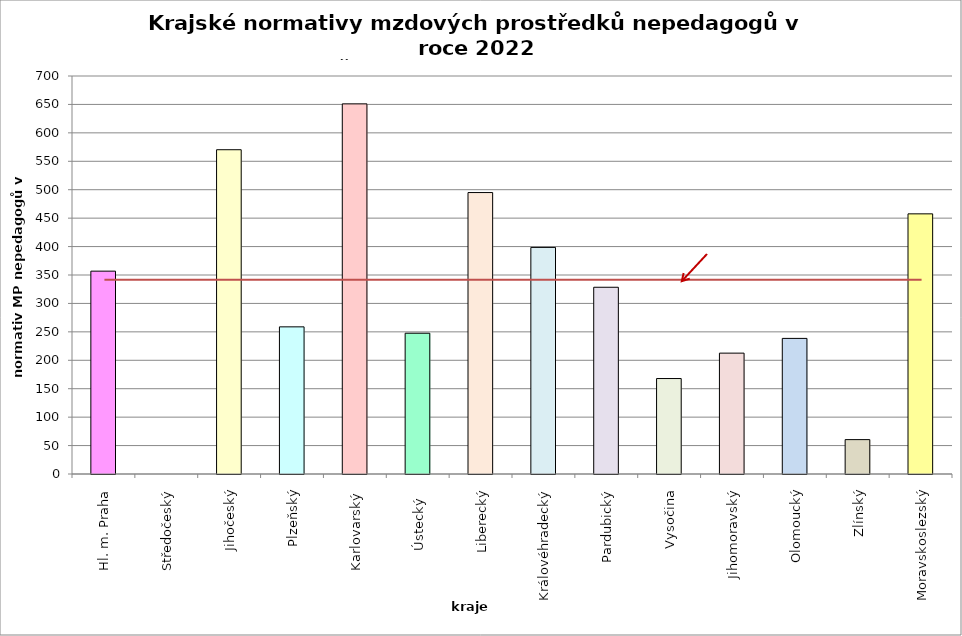
| Category | Series 0 |
|---|---|
| Hl. m. Praha | 356.784 |
| Středočeský | 0 |
| Jihočeský | 570.336 |
| Plzeňský | 258.792 |
| Karlovarský  | 651 |
| Ústecký   | 247.579 |
| Liberecký | 495 |
| Královéhradecký | 398.517 |
| Pardubický | 328.432 |
| Vysočina | 167.892 |
| Jihomoravský | 212.57 |
| Olomoucký | 238.483 |
| Zlínský | 60.48 |
| Moravskoslezský | 457.542 |